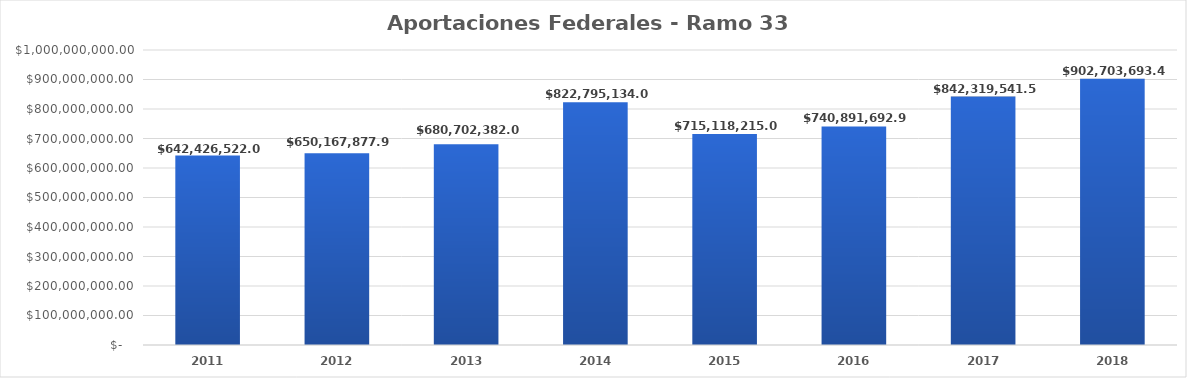
| Category | Aportaciones Federales - Ramo 33 FISM-FORTAMUN |
|---|---|
| 2011.0 | 642426522 |
| 2012.0 | 650167877.96 |
| 2013.0 | 680702382 |
| 2014.0 | 822795134 |
| 2015.0 | 715118215 |
| 2016.0 | 740891692.9 |
| 2017.0 | 842319541.5 |
| 2018.0 | 902703693.48 |